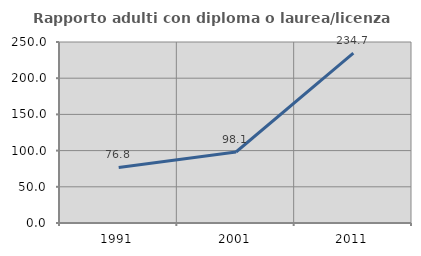
| Category | Rapporto adulti con diploma o laurea/licenza media  |
|---|---|
| 1991.0 | 76.795 |
| 2001.0 | 98.095 |
| 2011.0 | 234.658 |